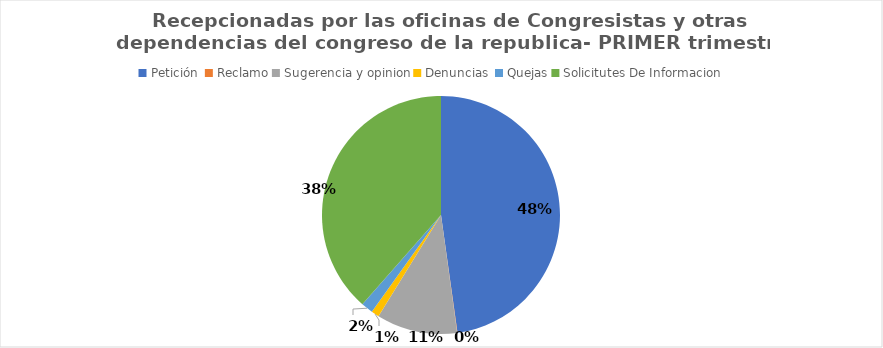
| Category | Series 0 |
|---|---|
| Petición  | 1036 |
| Reclamo | 1 |
| Sugerencia y opinion | 238 |
| Denuncias  | 23 |
| Quejas | 35 |
| Solicitutes De Informacion | 835 |